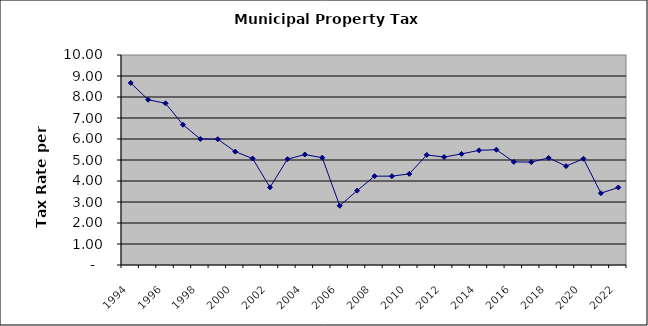
| Category | Rate |
|---|---|
| 1994.0 | 8.67 |
| 1995.0 | 7.87 |
| 1996.0 | 7.7 |
| 1997.0 | 6.68 |
| 1998.0 | 6 |
| 1999.0 | 5.99 |
| 2000.0 | 5.4 |
| 2001.0 | 5.07 |
| 2002.0 | 3.7 |
| 2003.0 | 5.04 |
| 2004.0 | 5.26 |
| 2005.0 | 5.11 |
| 2006.0 | 2.82 |
| 2007.0 | 3.54 |
| 2008.0 | 4.23 |
| 2009.0 | 4.23 |
| 2010.0 | 4.34 |
| 2011.0 | 5.24 |
| 2012.0 | 5.14 |
| 2013.0 | 5.29 |
| 2014.0 | 5.46 |
| 2015.0 | 5.49 |
| 2016.0 | 4.91 |
| 2017.0 | 4.9 |
| 2018.0 | 5.1 |
| 2019.0 | 4.71 |
| 2020.0 | 5.06 |
| 2021.0 | 3.42 |
| 2022.0 | 3.69 |